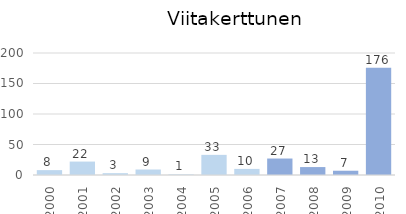
| Category | Series 0 |
|---|---|
| 2000.0 | 8 |
| 2001.0 | 22 |
| 2002.0 | 3 |
| 2003.0 | 9 |
| 2004.0 | 1 |
| 2005.0 | 33 |
| 2006.0 | 10 |
| 2007.0 | 27 |
| 2008.0 | 13 |
| 2009.0 | 7 |
| 2010.0 | 176 |